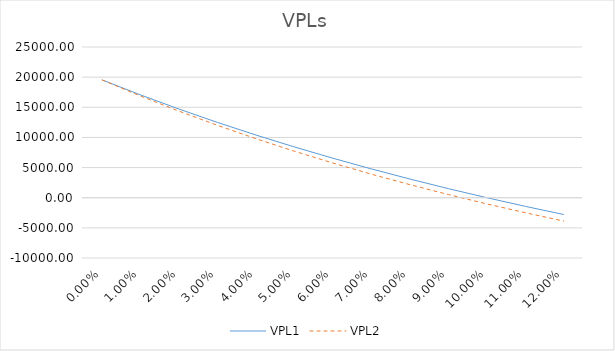
| Category | VPL1 | VPL2 |
|---|---|---|
| 0.0 | 19530 | 19530 |
| 0.01 | 17042.944 | 16856.4 |
| 0.02 | 14697.123 | 14348.899 |
| 0.03 | 12482.875 | 11995.02 |
| 0.04 | 10391.297 | 9783.362 |
| 0.05 | 8414.178 | 7703.497 |
| 0.06 | 6543.943 | 5745.874 |
| 0.07 | 4773.593 | 3901.743 |
| 0.08 | 3096.658 | 2163.073 |
| 0.09 | 1507.153 | 522.491 |
| 0.1 | -0.467 | -1026.783 |
| 0.11 | -1431.337 | -2490.985 |
| 0.12 | -2790.221 | -3875.859 |